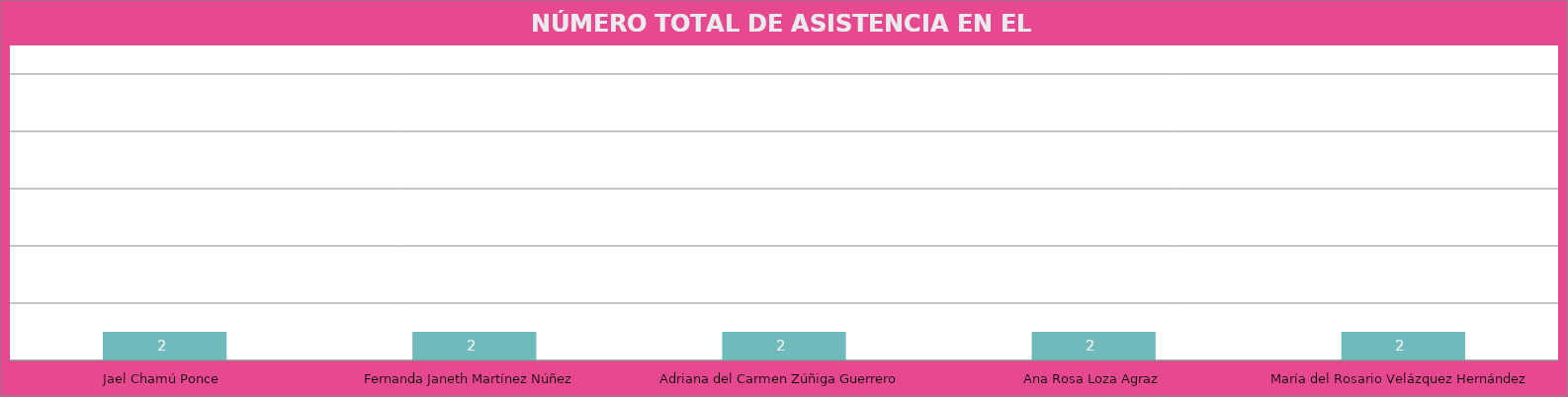
| Category | Jael Chamú Ponce |
|---|---|
| Jael Chamú Ponce | 2 |
| Fernanda Janeth Martínez Núñez | 2 |
| Adriana del Carmen Zúñiga Guerrero | 2 |
| Ana Rosa Loza Agraz | 2 |
| María del Rosario Velázquez Hernández | 2 |